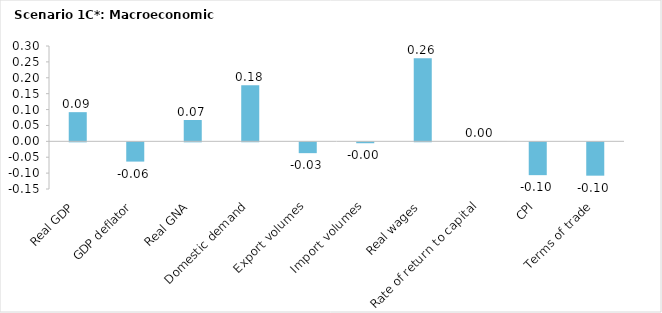
| Category | Series 0 |
|---|---|
| Real GDP | 0.092 |
| GDP deflator | -0.061 |
| Real GNA | 0.067 |
| Domestic demand | 0.176 |
| Export volumes | -0.034 |
| Import volumes | -0.003 |
| Real wages | 0.261 |
| Rate of return to capital | 0 |
| CPI | -0.103 |
| Terms of trade | -0.105 |